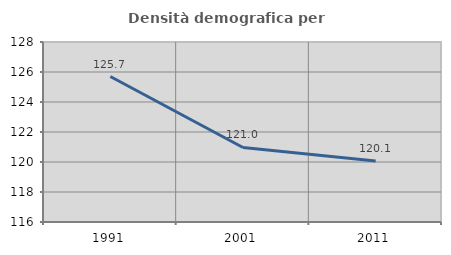
| Category | Densità demografica |
|---|---|
| 1991.0 | 125.697 |
| 2001.0 | 120.967 |
| 2011.0 | 120.061 |